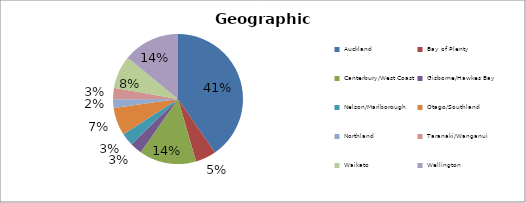
| Category | Series 0 |
|---|---|
| Auckland | 0.404 |
| Bay of Plenty | 0.051 |
| Canterbury/West Coast | 0.142 |
| Gisborne/Hawkes Bay | 0.03 |
| Nelson/Marlborough | 0.032 |
| Otago/Southland | 0.069 |
| Northland | 0.021 |
| Taranaki/Wanganui | 0.028 |
| Waikato | 0.081 |
| Wellington | 0.141 |